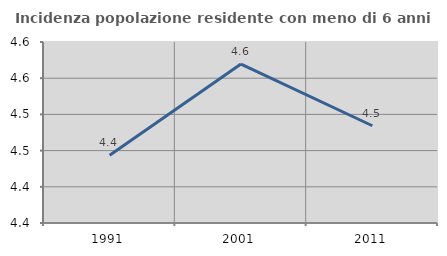
| Category | Incidenza popolazione residente con meno di 6 anni |
|---|---|
| 1991.0 | 4.444 |
| 2001.0 | 4.57 |
| 2011.0 | 4.484 |